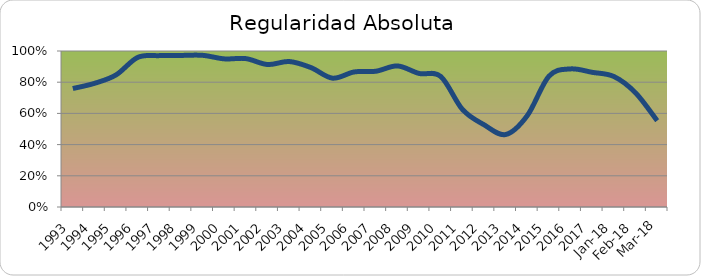
| Category | Series 0 |
|---|---|
| 1993.0 | 0.76 |
| 1994.0 | 0.793 |
| 1995.0 | 0.847 |
| 1996.0 | 0.959 |
| 1997.0 | 0.97 |
| 1998.0 | 0.972 |
| 1999.0 | 0.972 |
| 2000.0 | 0.95 |
| 2001.0 | 0.951 |
| 2002.0 | 0.913 |
| 2003.0 | 0.933 |
| 2004.0 | 0.894 |
| 2005.0 | 0.826 |
| 2006.0 | 0.866 |
| 2007.0 | 0.87 |
| 2008.0 | 0.904 |
| 2009.0 | 0.856 |
| 2010.0 | 0.837 |
| 2011.0 | 0.626 |
| 2012.0 | 0.527 |
| 2013.0 | 0.465 |
| 2014.0 | 0.586 |
| 2015.0 | 0.839 |
| 2016.0 | 0.885 |
| 2017.0 | 0.863 |
| 43101.0 | 0.836 |
| 43132.0 | 0.732 |
| 43160.0 | 0.553 |